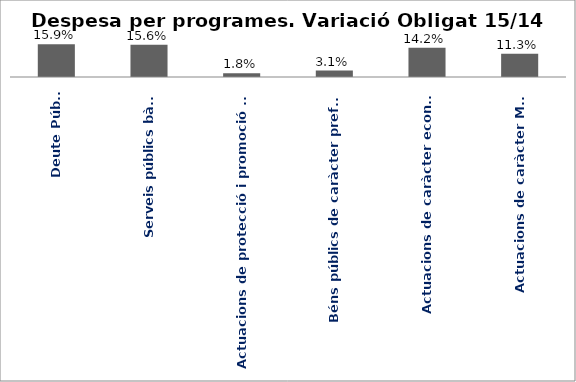
| Category | Series 0 |
|---|---|
| Deute Públic | 0.159 |
| Serveis públics bàsics | 0.156 |
| Actuacions de protecció i promoció social | 0.018 |
| Béns públics de caràcter preferent | 0.031 |
| Actuacions de caràcter econòmic | 0.142 |
| Actuacions de caràcter Marçal | 0.113 |